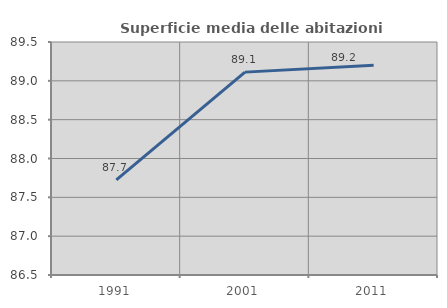
| Category | Superficie media delle abitazioni occupate |
|---|---|
| 1991.0 | 87.726 |
| 2001.0 | 89.112 |
| 2011.0 | 89.2 |